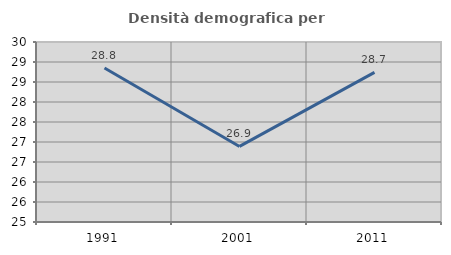
| Category | Densità demografica |
|---|---|
| 1991.0 | 28.849 |
| 2001.0 | 26.889 |
| 2011.0 | 28.74 |